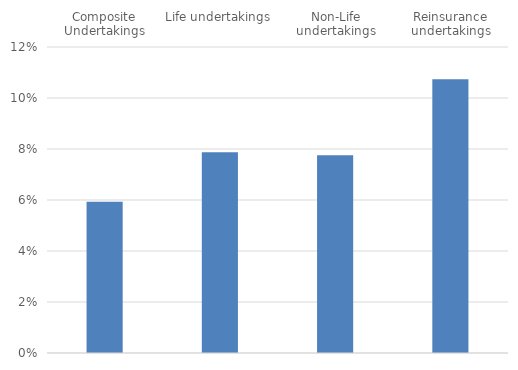
| Category | Series 0 |
|---|---|
| Composite Undertakings | 0.059 |
| Life undertakings | 0.079 |
| Non-Life undertakings | 0.078 |
| Reinsurance undertakings | 0.107 |